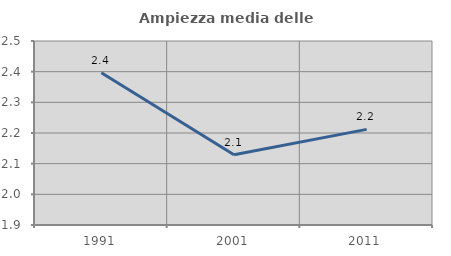
| Category | Ampiezza media delle famiglie |
|---|---|
| 1991.0 | 2.397 |
| 2001.0 | 2.129 |
| 2011.0 | 2.212 |